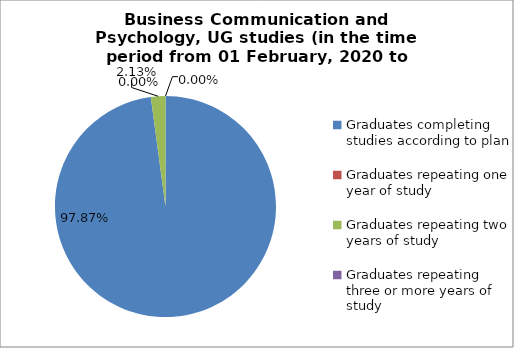
| Category | Series 0 |
|---|---|
| Graduates completing studies according to plan | 97.872 |
| Graduates repeating one year of study | 0 |
| Graduates repeating two years of study | 2.128 |
| Graduates repeating three or more years of study | 0 |